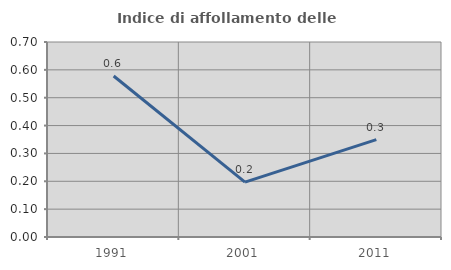
| Category | Indice di affollamento delle abitazioni  |
|---|---|
| 1991.0 | 0.578 |
| 2001.0 | 0.197 |
| 2011.0 | 0.35 |